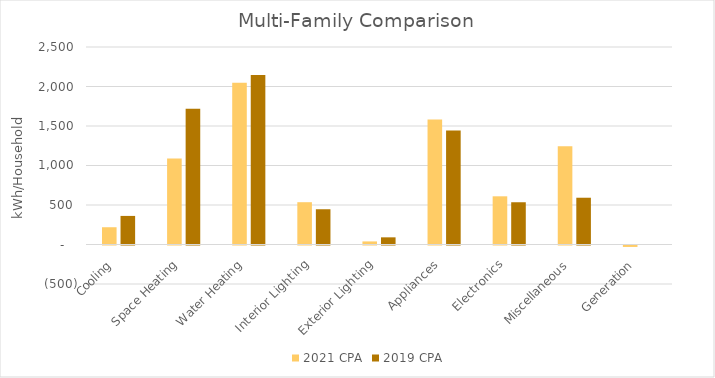
| Category | 2021 CPA | 2019 CPA |
|---|---|---|
|  Cooling  | 218.583 | 361.778 |
|  Space Heating  | 1088.584 | 1719.637 |
|  Water Heating  | 2046.725 | 2146.586 |
|  Interior Lighting  | 535.468 | 446.277 |
|  Exterior Lighting  | 39.059 | 90.635 |
|  Appliances  | 1582.536 | 1442.775 |
|  Electronics  | 610.06 | 534.826 |
|  Miscellaneous  | 1243.303 | 592.03 |
|  Generation  | -18.267 | 0 |